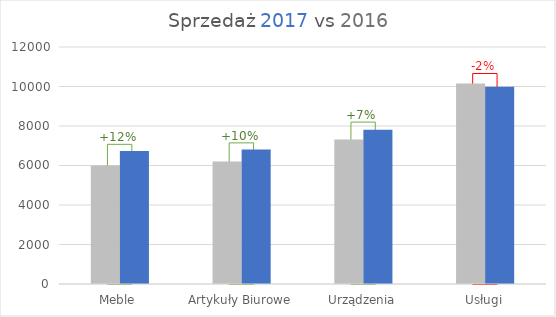
| Category | Tech |
|---|---|
| Meble | 7071.923 |
| Artykuły Biurowe | 7146.065 |
| Urządzenia | 8197.937 |
| Usługi | 10658.55 |